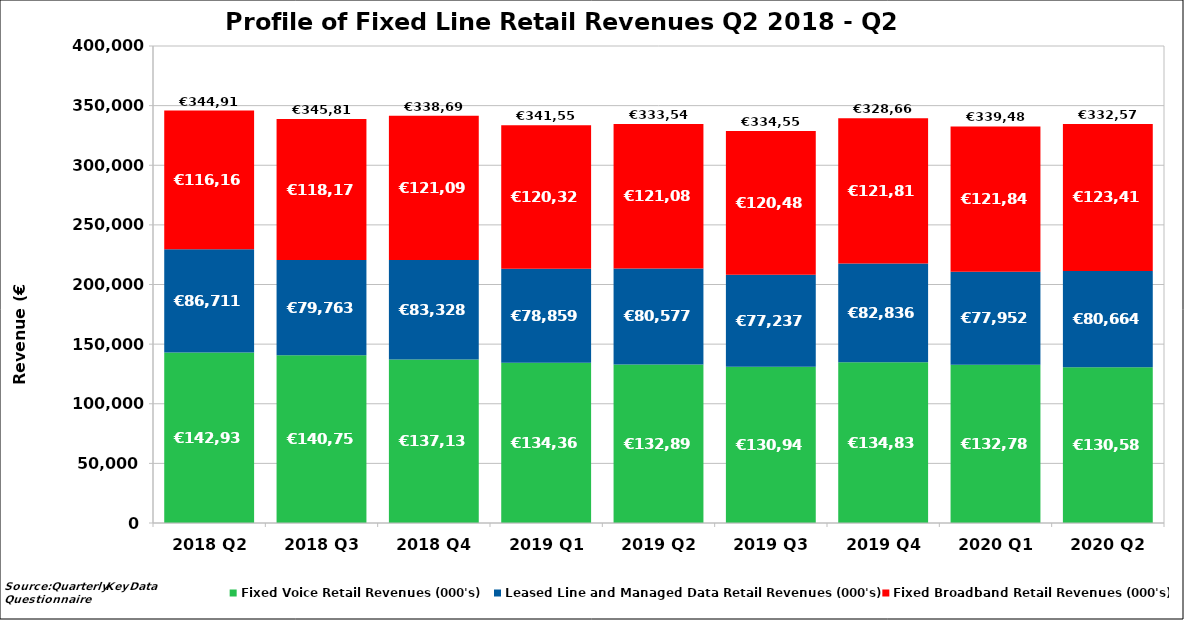
| Category | Fixed Voice Retail Revenues (000's) | Leased Line and Managed Data Retail Revenues (000's) | Fixed Broadband Retail Revenues (000's) |
|---|---|---|---|
| 2018 Q2 | 142938.307 | 86711.009 | 116160.553 |
| 2018 Q3 | 140759.241 | 79762.582 | 118170.541 |
| 2018 Q4 | 137137.479 | 83327.973 | 121089.96 |
| 2019 Q1 | 134363.642 | 78859.119 | 120323.708 |
| 2019 Q2 | 132889.679 | 80576.923 | 121089.059 |
| 2019 Q3 | 130946.24 | 77236.7 | 120483.566 |
| 2019 Q4 | 134837.825 | 82836.465 | 121812.888 |
| 2020 Q1 | 132784 | 77952.335 | 121840 |
| 2020 Q2 | 130588.556 | 80663.523 | 123415 |